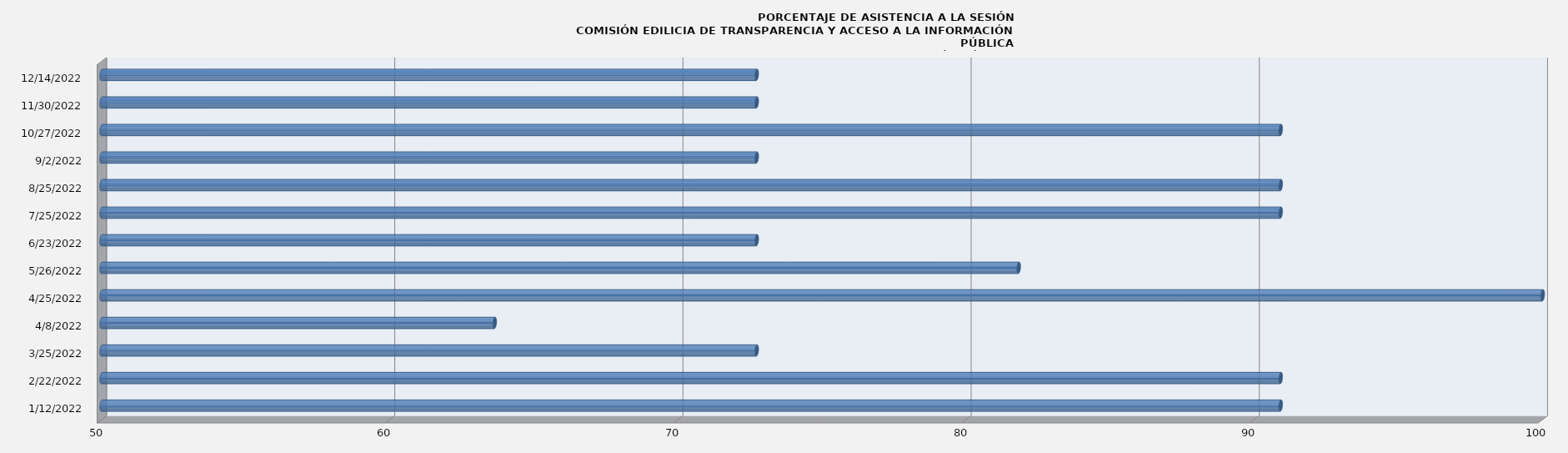
| Category | Series 0 |
|---|---|
| 1/12/22 | 90.909 |
| 2/22/22 | 90.909 |
| 3/25/22 | 72.727 |
| 4/8/22 | 63.636 |
| 4/25/22 | 100 |
| 5/26/22 | 81.818 |
| 6/23/22 | 72.727 |
| 7/25/22 | 90.909 |
| 8/25/22 | 90.909 |
| 9/2/22 | 72.727 |
| 10/27/22 | 90.909 |
| 11/30/22 | 72.727 |
| 12/14/22 | 72.727 |